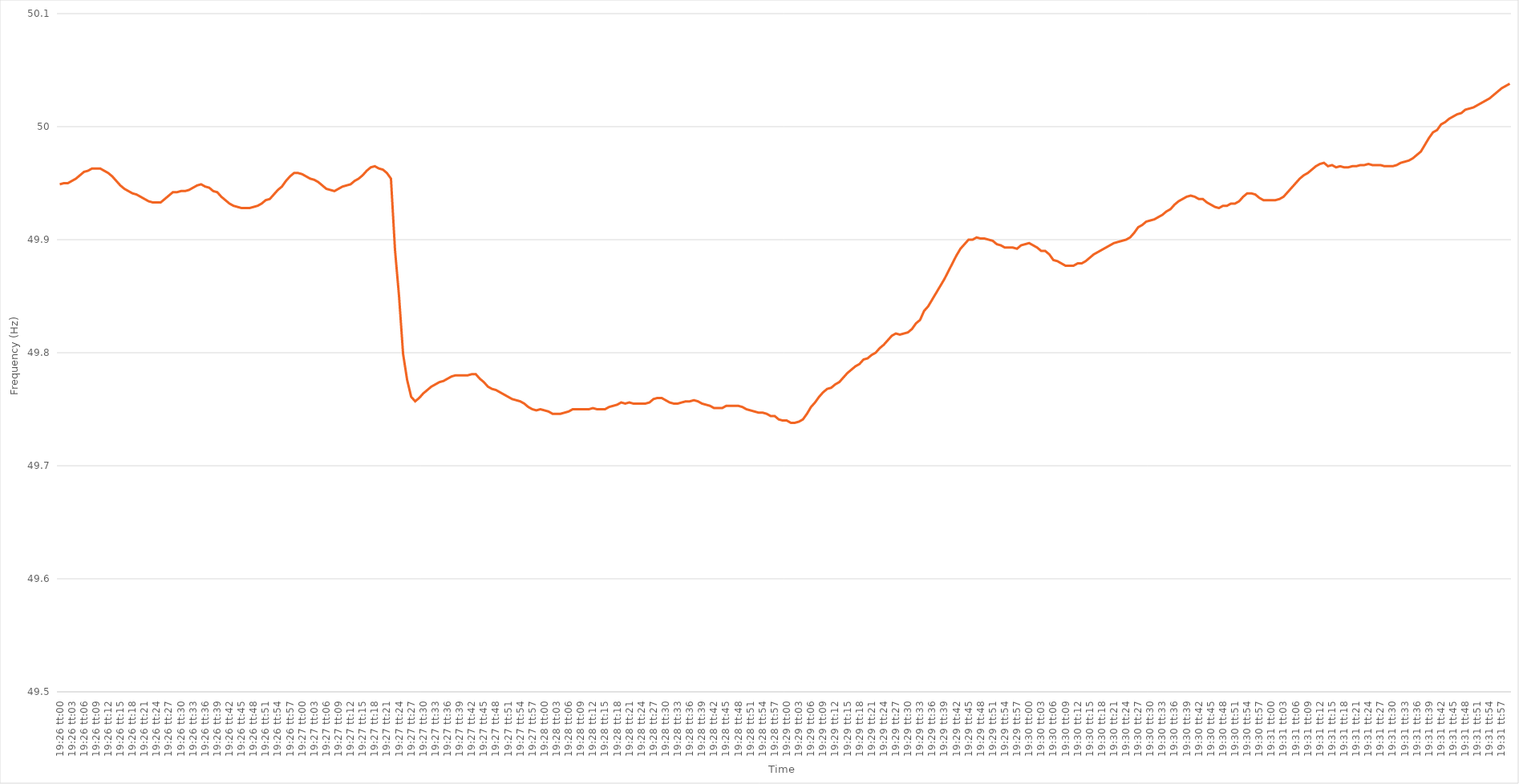
| Category | Series 0 |
|---|---|
| 0.8097222222222222 | 49.949 |
| 0.8097337962962964 | 49.95 |
| 0.8097453703703703 | 49.95 |
| 0.8097569444444445 | 49.952 |
| 0.8097685185185185 | 49.954 |
| 0.8097800925925926 | 49.957 |
| 0.8097916666666666 | 49.96 |
| 0.8098032407407407 | 49.961 |
| 0.8098148148148149 | 49.963 |
| 0.8098263888888889 | 49.963 |
| 0.809837962962963 | 49.963 |
| 0.809849537037037 | 49.961 |
| 0.8098611111111111 | 49.959 |
| 0.8098726851851853 | 49.956 |
| 0.8098842592592592 | 49.952 |
| 0.8098958333333334 | 49.948 |
| 0.8099074074074074 | 49.945 |
| 0.8099189814814814 | 49.943 |
| 0.8099305555555555 | 49.941 |
| 0.8099421296296296 | 49.94 |
| 0.8099537037037038 | 49.938 |
| 0.8099652777777777 | 49.936 |
| 0.8099768518518519 | 49.934 |
| 0.8099884259259259 | 49.933 |
| 0.81 | 49.933 |
| 0.810011574074074 | 49.933 |
| 0.8100231481481481 | 49.936 |
| 0.8100347222222223 | 49.939 |
| 0.8100462962962963 | 49.942 |
| 0.8100578703703704 | 49.942 |
| 0.8100694444444444 | 49.943 |
| 0.8100810185185185 | 49.943 |
| 0.8100925925925927 | 49.944 |
| 0.8101041666666666 | 49.946 |
| 0.8101157407407408 | 49.948 |
| 0.8101273148148148 | 49.949 |
| 0.810138888888889 | 49.947 |
| 0.8101504629629629 | 49.946 |
| 0.810162037037037 | 49.943 |
| 0.8101736111111112 | 49.942 |
| 0.8101851851851851 | 49.938 |
| 0.8101967592592593 | 49.935 |
| 0.8102083333333333 | 49.932 |
| 0.8102199074074075 | 49.93 |
| 0.8102314814814814 | 49.929 |
| 0.8102430555555555 | 49.928 |
| 0.8102546296296297 | 49.928 |
| 0.8102662037037037 | 49.928 |
| 0.8102777777777778 | 49.929 |
| 0.8102893518518518 | 49.93 |
| 0.810300925925926 | 49.932 |
| 0.8103125000000001 | 49.935 |
| 0.810324074074074 | 49.936 |
| 0.8103356481481482 | 49.94 |
| 0.8103472222222222 | 49.944 |
| 0.8103587962962964 | 49.947 |
| 0.8103703703703703 | 49.952 |
| 0.8103819444444444 | 49.956 |
| 0.8103935185185186 | 49.959 |
| 0.8104050925925925 | 49.959 |
| 0.8104166666666667 | 49.958 |
| 0.8104282407407407 | 49.956 |
| 0.8104398148148149 | 49.954 |
| 0.8104513888888888 | 49.953 |
| 0.8104629629629629 | 49.951 |
| 0.8104745370370371 | 49.948 |
| 0.8104861111111111 | 49.945 |
| 0.8104976851851852 | 49.944 |
| 0.8105092592592592 | 49.943 |
| 0.8105208333333334 | 49.945 |
| 0.8105324074074075 | 49.947 |
| 0.8105439814814814 | 49.948 |
| 0.8105555555555556 | 49.949 |
| 0.8105671296296296 | 49.952 |
| 0.8105787037037038 | 49.954 |
| 0.8105902777777777 | 49.957 |
| 0.8106018518518519 | 49.961 |
| 0.810613425925926 | 49.964 |
| 0.8106249999999999 | 49.965 |
| 0.8106365740740741 | 49.963 |
| 0.8106481481481481 | 49.962 |
| 0.8106597222222223 | 49.959 |
| 0.8106712962962962 | 49.954 |
| 0.8106828703703703 | 49.891 |
| 0.8106944444444445 | 49.85 |
| 0.8107060185185185 | 49.799 |
| 0.8107175925925926 | 49.776 |
| 0.8107291666666666 | 49.761 |
| 0.8107407407407408 | 49.757 |
| 0.8107523148148149 | 49.76 |
| 0.8107638888888888 | 49.764 |
| 0.810775462962963 | 49.767 |
| 0.810787037037037 | 49.77 |
| 0.8107986111111112 | 49.772 |
| 0.8108101851851851 | 49.774 |
| 0.8108217592592593 | 49.775 |
| 0.8108333333333334 | 49.777 |
| 0.8108449074074073 | 49.779 |
| 0.8108564814814815 | 49.78 |
| 0.8108680555555555 | 49.78 |
| 0.8108796296296297 | 49.78 |
| 0.8108912037037036 | 49.78 |
| 0.8109027777777778 | 49.781 |
| 0.8109143518518519 | 49.781 |
| 0.8109259259259259 | 49.777 |
| 0.8109375 | 49.774 |
| 0.810949074074074 | 49.77 |
| 0.8109606481481482 | 49.768 |
| 0.8109722222222223 | 49.767 |
| 0.8109837962962962 | 49.765 |
| 0.8109953703703704 | 49.763 |
| 0.8110069444444444 | 49.761 |
| 0.8110185185185186 | 49.759 |
| 0.8110300925925925 | 49.758 |
| 0.8110416666666667 | 49.757 |
| 0.8110532407407408 | 49.755 |
| 0.8110648148148148 | 49.752 |
| 0.8110763888888889 | 49.75 |
| 0.8110879629629629 | 49.749 |
| 0.8110995370370371 | 49.75 |
| 0.811111111111111 | 49.749 |
| 0.8111226851851852 | 49.748 |
| 0.8111342592592593 | 49.746 |
| 0.8111458333333333 | 49.746 |
| 0.8111574074074074 | 49.746 |
| 0.8111689814814814 | 49.747 |
| 0.8111805555555556 | 49.748 |
| 0.8111921296296297 | 49.75 |
| 0.8112037037037036 | 49.75 |
| 0.8112152777777778 | 49.75 |
| 0.8112268518518518 | 49.75 |
| 0.811238425925926 | 49.75 |
| 0.8112499999999999 | 49.751 |
| 0.8112615740740741 | 49.75 |
| 0.8112731481481482 | 49.75 |
| 0.8112847222222223 | 49.75 |
| 0.8112962962962963 | 49.752 |
| 0.8113078703703703 | 49.753 |
| 0.8113194444444445 | 49.754 |
| 0.8113310185185184 | 49.756 |
| 0.8113425925925926 | 49.755 |
| 0.8113541666666667 | 49.756 |
| 0.8113657407407407 | 49.755 |
| 0.8113773148148148 | 49.755 |
| 0.8113888888888888 | 49.755 |
| 0.811400462962963 | 49.755 |
| 0.8114120370370371 | 49.756 |
| 0.811423611111111 | 49.759 |
| 0.8114351851851852 | 49.76 |
| 0.8114467592592592 | 49.76 |
| 0.8114583333333334 | 49.758 |
| 0.8114699074074073 | 49.756 |
| 0.8114814814814815 | 49.755 |
| 0.8114930555555556 | 49.755 |
| 0.8115046296296297 | 49.756 |
| 0.8115162037037037 | 49.757 |
| 0.8115277777777777 | 49.757 |
| 0.8115393518518519 | 49.758 |
| 0.811550925925926 | 49.757 |
| 0.8115625 | 49.755 |
| 0.8115740740740741 | 49.754 |
| 0.8115856481481482 | 49.753 |
| 0.8115972222222222 | 49.751 |
| 0.8116087962962962 | 49.751 |
| 0.8116203703703704 | 49.751 |
| 0.8116319444444445 | 49.753 |
| 0.8116435185185185 | 49.753 |
| 0.8116550925925926 | 49.753 |
| 0.8116666666666666 | 49.753 |
| 0.8116782407407408 | 49.752 |
| 0.8116898148148147 | 49.75 |
| 0.8117013888888889 | 49.749 |
| 0.811712962962963 | 49.748 |
| 0.8117245370370371 | 49.747 |
| 0.8117361111111111 | 49.747 |
| 0.8117476851851851 | 49.746 |
| 0.8117592592592593 | 49.744 |
| 0.8117708333333334 | 49.744 |
| 0.8117824074074074 | 49.741 |
| 0.8117939814814815 | 49.74 |
| 0.8118055555555556 | 49.74 |
| 0.8118171296296296 | 49.738 |
| 0.8118287037037036 | 49.738 |
| 0.8118402777777778 | 49.739 |
| 0.8118518518518519 | 49.741 |
| 0.8118634259259259 | 49.746 |
| 0.811875 | 49.752 |
| 0.811886574074074 | 49.756 |
| 0.8118981481481482 | 49.761 |
| 0.8119097222222221 | 49.765 |
| 0.8119212962962963 | 49.768 |
| 0.8119328703703704 | 49.769 |
| 0.8119444444444445 | 49.772 |
| 0.8119560185185185 | 49.774 |
| 0.8119675925925925 | 49.778 |
| 0.8119791666666667 | 49.782 |
| 0.8119907407407408 | 49.785 |
| 0.8120023148148148 | 49.788 |
| 0.8120138888888889 | 49.79 |
| 0.812025462962963 | 49.794 |
| 0.812037037037037 | 49.795 |
| 0.812048611111111 | 49.798 |
| 0.8120601851851852 | 49.8 |
| 0.8120717592592593 | 49.804 |
| 0.8120833333333333 | 49.807 |
| 0.8120949074074074 | 49.811 |
| 0.8121064814814815 | 49.815 |
| 0.8121180555555556 | 49.817 |
| 0.8121296296296295 | 49.816 |
| 0.8121412037037037 | 49.817 |
| 0.8121527777777778 | 49.818 |
| 0.8121643518518519 | 49.821 |
| 0.8121759259259259 | 49.826 |
| 0.8121875 | 49.829 |
| 0.8121990740740741 | 49.837 |
| 0.8122106481481483 | 49.841 |
| 0.8122222222222222 | 49.847 |
| 0.8122337962962963 | 49.853 |
| 0.8122453703703704 | 49.859 |
| 0.8122569444444444 | 49.865 |
| 0.8122685185185184 | 49.872 |
| 0.8122800925925926 | 49.879 |
| 0.8122916666666667 | 49.886 |
| 0.8123032407407407 | 49.892 |
| 0.8123148148148148 | 49.896 |
| 0.8123263888888889 | 49.9 |
| 0.812337962962963 | 49.9 |
| 0.8123495370370369 | 49.902 |
| 0.8123611111111111 | 49.901 |
| 0.8123726851851852 | 49.901 |
| 0.8123842592592593 | 49.9 |
| 0.8123958333333333 | 49.899 |
| 0.8124074074074074 | 49.896 |
| 0.8124189814814815 | 49.895 |
| 0.8124305555555557 | 49.893 |
| 0.8124421296296296 | 49.893 |
| 0.8124537037037037 | 49.893 |
| 0.8124652777777778 | 49.892 |
| 0.8124768518518519 | 49.895 |
| 0.8124884259259259 | 49.896 |
| 0.8125 | 49.897 |
| 0.8125115740740741 | 49.895 |
| 0.8125231481481481 | 49.893 |
| 0.8125347222222222 | 49.89 |
| 0.8125462962962963 | 49.89 |
| 0.8125578703703704 | 49.887 |
| 0.8125694444444443 | 49.882 |
| 0.8125810185185185 | 49.881 |
| 0.8125925925925926 | 49.879 |
| 0.8126041666666667 | 49.877 |
| 0.8126157407407407 | 49.877 |
| 0.8126273148148148 | 49.877 |
| 0.8126388888888889 | 49.879 |
| 0.8126504629629631 | 49.879 |
| 0.812662037037037 | 49.881 |
| 0.8126736111111111 | 49.884 |
| 0.8126851851851852 | 49.887 |
| 0.8126967592592593 | 49.889 |
| 0.8127083333333333 | 49.891 |
| 0.8127199074074074 | 49.893 |
| 0.8127314814814816 | 49.895 |
| 0.8127430555555556 | 49.897 |
| 0.8127546296296296 | 49.898 |
| 0.8127662037037037 | 49.899 |
| 0.8127777777777778 | 49.9 |
| 0.8127893518518517 | 49.902 |
| 0.8128009259259259 | 49.906 |
| 0.8128125 | 49.911 |
| 0.8128240740740741 | 49.913 |
| 0.8128356481481481 | 49.916 |
| 0.8128472222222222 | 49.917 |
| 0.8128587962962963 | 49.918 |
| 0.8128703703703705 | 49.92 |
| 0.8128819444444444 | 49.922 |
| 0.8128935185185185 | 49.925 |
| 0.8129050925925926 | 49.927 |
| 0.8129166666666667 | 49.931 |
| 0.8129282407407407 | 49.934 |
| 0.8129398148148148 | 49.936 |
| 0.812951388888889 | 49.938 |
| 0.812962962962963 | 49.939 |
| 0.812974537037037 | 49.938 |
| 0.8129861111111111 | 49.936 |
| 0.8129976851851852 | 49.936 |
| 0.8130092592592592 | 49.933 |
| 0.8130208333333333 | 49.931 |
| 0.8130324074074075 | 49.929 |
| 0.8130439814814815 | 49.928 |
| 0.8130555555555555 | 49.93 |
| 0.8130671296296296 | 49.93 |
| 0.8130787037037037 | 49.932 |
| 0.8130902777777779 | 49.932 |
| 0.8131018518518518 | 49.934 |
| 0.813113425925926 | 49.938 |
| 0.813125 | 49.941 |
| 0.8131365740740741 | 49.941 |
| 0.8131481481481481 | 49.94 |
| 0.8131597222222222 | 49.937 |
| 0.8131712962962964 | 49.935 |
| 0.8131828703703704 | 49.935 |
| 0.8131944444444444 | 49.935 |
| 0.8132060185185185 | 49.935 |
| 0.8132175925925926 | 49.936 |
| 0.8132291666666666 | 49.938 |
| 0.8132407407407407 | 49.942 |
| 0.8132523148148149 | 49.946 |
| 0.8132638888888889 | 49.95 |
| 0.8132754629629629 | 49.954 |
| 0.813287037037037 | 49.957 |
| 0.8132986111111111 | 49.959 |
| 0.8133101851851853 | 49.962 |
| 0.8133217592592592 | 49.965 |
| 0.8133333333333334 | 49.967 |
| 0.8133449074074074 | 49.968 |
| 0.8133564814814815 | 49.965 |
| 0.8133680555555555 | 49.966 |
| 0.8133796296296296 | 49.964 |
| 0.8133912037037038 | 49.965 |
| 0.8134027777777778 | 49.964 |
| 0.8134143518518518 | 49.964 |
| 0.8134259259259259 | 49.965 |
| 0.8134375 | 49.965 |
| 0.813449074074074 | 49.966 |
| 0.8134606481481481 | 49.966 |
| 0.8134722222222223 | 49.967 |
| 0.8134837962962963 | 49.966 |
| 0.8134953703703703 | 49.966 |
| 0.8135069444444444 | 49.966 |
| 0.8135185185185185 | 49.965 |
| 0.8135300925925927 | 49.965 |
| 0.8135416666666666 | 49.965 |
| 0.8135532407407408 | 49.966 |
| 0.8135648148148148 | 49.968 |
| 0.813576388888889 | 49.969 |
| 0.8135879629629629 | 49.97 |
| 0.813599537037037 | 49.972 |
| 0.8136111111111112 | 49.975 |
| 0.8136226851851852 | 49.978 |
| 0.8136342592592593 | 49.984 |
| 0.8136458333333333 | 49.99 |
| 0.8136574074074074 | 49.995 |
| 0.8136689814814816 | 49.997 |
| 0.8136805555555555 | 50.002 |
| 0.8136921296296297 | 50.004 |
| 0.8137037037037037 | 50.007 |
| 0.8137152777777777 | 50.009 |
| 0.8137268518518518 | 50.011 |
| 0.8137384259259259 | 50.012 |
| 0.8137500000000001 | 50.015 |
| 0.813761574074074 | 50.016 |
| 0.8137731481481482 | 50.017 |
| 0.8137847222222222 | 50.019 |
| 0.8137962962962964 | 50.021 |
| 0.8138078703703703 | 50.023 |
| 0.8138194444444444 | 50.025 |
| 0.8138310185185186 | 50.028 |
| 0.8138425925925926 | 50.031 |
| 0.8138541666666667 | 50.034 |
| 0.8138657407407407 | 50.036 |
| 0.8138773148148148 | 50.038 |